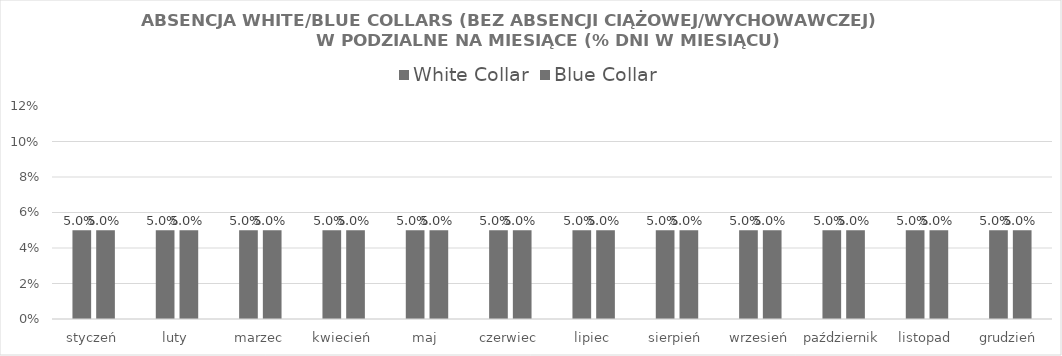
| Category | White Collar | Blue Collar |
|---|---|---|
| styczeń | 0.05 | 0.05 |
| luty | 0.05 | 0.05 |
| marzec | 0.05 | 0.05 |
| kwiecień | 0.05 | 0.05 |
| maj | 0.05 | 0.05 |
| czerwiec | 0.05 | 0.05 |
| lipiec | 0.05 | 0.05 |
| sierpień | 0.05 | 0.05 |
| wrzesień | 0.05 | 0.05 |
| październik | 0.05 | 0.05 |
| listopad | 0.05 | 0.05 |
| grudzień | 0.05 | 0.05 |